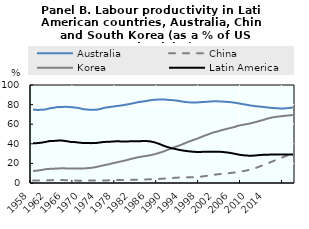
| Category | Australia | China | Korea | Latin America |
|---|---|---|---|---|
| 0 | 74.984 | 2.578 | 12.215 | 40.492 |
| 1 | 74.563 | 2.566 | 12.639 | 40.711 |
| 2 | 74.662 | 2.612 | 13.312 | 41.166 |
| 3 | 75.096 | 2.723 | 14.068 | 41.934 |
| 4 | 76.225 | 2.839 | 14.428 | 42.814 |
| 5 | 76.866 | 2.985 | 14.628 | 42.938 |
| 6 | 77.572 | 3.127 | 14.822 | 43.288 |
| 7 | 77.649 | 3.012 | 14.995 | 43.267 |
| 8 | 77.705 | 2.84 | 14.881 | 42.675 |
| 9 | 77.379 | 2.652 | 14.752 | 41.899 |
| 10 | 77.031 | 2.482 | 14.78 | 41.704 |
| 11 | 76.366 | 2.367 | 14.699 | 41.204 |
| 12 | 75.329 | 2.442 | 14.81 | 40.792 |
| 13 | 74.932 | 2.509 | 15.144 | 40.698 |
| 14 | 74.604 | 2.506 | 15.555 | 40.684 |
| 15 | 74.7 | 2.518 | 16.265 | 40.811 |
| 16 | 75.481 | 2.568 | 17.245 | 41.394 |
| 17 | 76.746 | 2.606 | 18.205 | 41.872 |
| 18 | 77.368 | 2.696 | 19.071 | 42.078 |
| 19 | 77.94 | 2.852 | 20.147 | 42.288 |
| 20 | 78.548 | 2.97 | 21.104 | 42.598 |
| 21 | 79.085 | 3.045 | 22.014 | 42.421 |
| 22 | 79.823 | 3.082 | 22.955 | 42.373 |
| 23 | 80.57 | 3.147 | 24.172 | 42.484 |
| 24 | 81.451 | 3.246 | 25.221 | 42.577 |
| 25 | 82.455 | 3.363 | 26.248 | 42.579 |
| 26 | 83.039 | 3.481 | 26.948 | 42.788 |
| 27 | 83.601 | 3.636 | 27.627 | 42.788 |
| 28 | 84.472 | 3.809 | 28.365 | 42.426 |
| 29 | 85.009 | 3.975 | 29.412 | 41.453 |
| 30 | 85.136 | 4.178 | 30.595 | 40.066 |
| 31 | 85.339 | 4.417 | 31.975 | 38.31 |
| 32 | 84.924 | 4.696 | 33.672 | 36.758 |
| 33 | 84.594 | 5.001 | 35.341 | 35.513 |
| 34 | 84.248 | 5.332 | 37.023 | 34.646 |
| 35 | 83.59 | 5.607 | 38.384 | 33.696 |
| 36 | 82.829 | 5.664 | 40.149 | 32.987 |
| 37 | 82.445 | 5.753 | 41.967 | 32.421 |
| 38 | 82.033 | 5.883 | 43.514 | 31.96 |
| 39 | 82.165 | 6.092 | 44.97 | 31.69 |
| 40 | 82.503 | 6.436 | 46.708 | 31.722 |
| 41 | 82.754 | 7.047 | 48.433 | 31.85 |
| 42 | 83.074 | 7.678 | 49.931 | 31.905 |
| 43 | 83.329 | 8.298 | 51.551 | 31.993 |
| 44 | 83.333 | 8.84 | 52.564 | 32.007 |
| 45 | 83.152 | 9.306 | 53.913 | 31.741 |
| 46 | 82.86 | 9.73 | 55.009 | 31.307 |
| 47 | 82.529 | 10.184 | 56.011 | 30.77 |
| 48 | 82.029 | 10.68 | 57.097 | 29.903 |
| 49 | 81.255 | 11.28 | 58.523 | 29.016 |
| 50 | 80.502 | 11.983 | 59.334 | 28.39 |
| 51 | 79.807 | 12.839 | 60.057 | 27.983 |
| 52 | 79.022 | 13.891 | 60.973 | 27.808 |
| 53 | 78.435 | 15.225 | 62.052 | 28.054 |
| 54 | 78.002 | 16.715 | 63.256 | 28.493 |
| 55 | 77.621 | 18.363 | 64.448 | 28.789 |
| 56 | 77.046 | 20.089 | 65.79 | 28.929 |
| 57 | 76.576 | 21.842 | 66.869 | 28.991 |
| 58 | 76.275 | 23.508 | 67.517 | 28.992 |
| 59 | 76.104 | 25.19 | 68.01 | 28.985 |
| 60 | 76.107 | 26.898 | 68.534 | 29.058 |
| 61 | 76.488 | 28.678 | 68.896 | 29.155 |
| 62 | 77.157 | 30.499 | 69.419 | 29.169 |